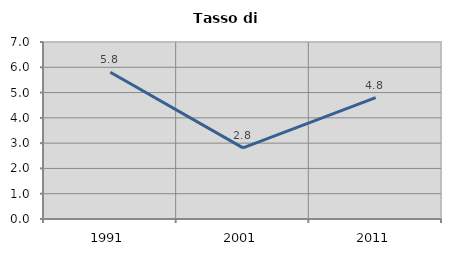
| Category | Tasso di disoccupazione   |
|---|---|
| 1991.0 | 5.806 |
| 2001.0 | 2.811 |
| 2011.0 | 4.803 |